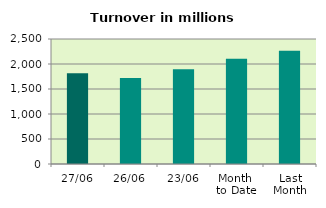
| Category | Series 0 |
|---|---|
| 27/06 | 1814.908 |
| 26/06 | 1720.307 |
| 23/06 | 1893.083 |
| Month 
to Date | 2106.41 |
| Last
Month | 2265.206 |